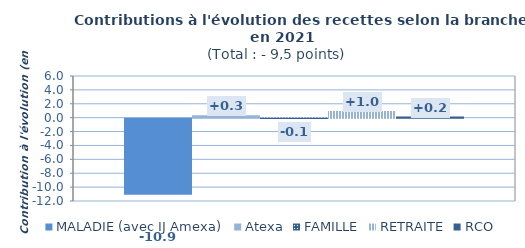
| Category | MALADIE (avec IJ Amexa) | Atexa | FAMILLE | RETRAITE | RCO |
|---|---|---|---|---|---|
| Contri croiss | -10.945 | 0.331 | -0.066 | 0.971 | 0.167 |